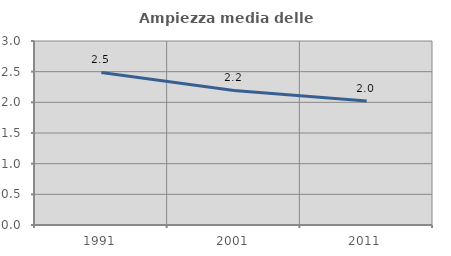
| Category | Ampiezza media delle famiglie |
|---|---|
| 1991.0 | 2.487 |
| 2001.0 | 2.194 |
| 2011.0 | 2.021 |